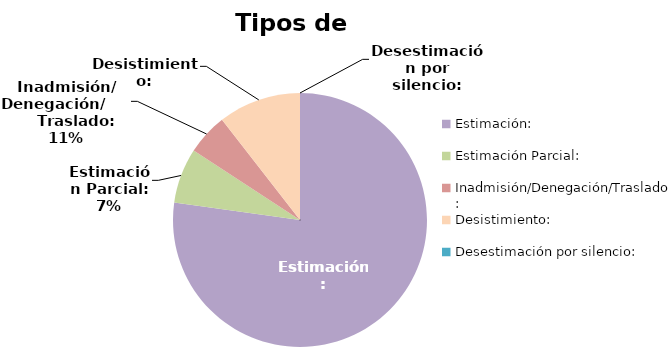
| Category | Tipos de resolución |
|---|---|
| Estimación: | 44 |
| Estimación Parcial: | 4 |
| Inadmisión/Denegación/Traslado: | 3 |
| Desistimiento: | 6 |
| Desestimación por silencio: | 0 |